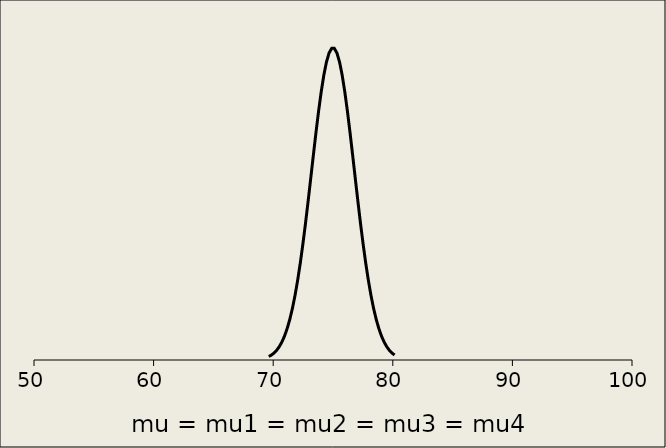
| Category | All conditions |
|---|---|
| 69.63343685400051 | 0.002 |
| 69.85248024771477 | 0.004 |
| 70.07152364142902 | 0.005 |
| 70.29056703514328 | 0.007 |
| 70.50961042885754 | 0.01 |
| 70.7286538225718 | 0.013 |
| 70.94769721628604 | 0.017 |
| 71.16674061000033 | 0.022 |
| 71.38578400371459 | 0.029 |
| 71.60482739742885 | 0.037 |
| 71.82387079114312 | 0.046 |
| 72.04291418485738 | 0.057 |
| 72.26195757857164 | 0.069 |
| 72.4810009722859 | 0.083 |
| 72.70004436600016 | 0.098 |
| 72.91908775971442 | 0.113 |
| 73.13813115342867 | 0.13 |
| 73.35717454714293 | 0.146 |
| 73.5762179408572 | 0.162 |
| 73.79526133457145 | 0.178 |
| 74.0143047282857 | 0.192 |
| 74.23334812199997 | 0.203 |
| 74.45239151571424 | 0.213 |
| 74.6714349094285 | 0.219 |
| 74.89047830314276 | 0.223 |
| 75.10952169685702 | 0.223 |
| 75.32856509057127 | 0.219 |
| 75.54760848428555 | 0.213 |
| 75.7666518779998 | 0.203 |
| 75.98569527171406 | 0.192 |
| 76.20473866542832 | 0.178 |
| 76.42378205914258 | 0.162 |
| 76.64282545285684 | 0.146 |
| 76.8618688465711 | 0.13 |
| 77.08091224028534 | 0.113 |
| 77.29995563399962 | 0.098 |
| 77.51899902771387 | 0.083 |
| 77.73804242142813 | 0.069 |
| 77.9570858151424 | 0.057 |
| 78.17612920885666 | 0.046 |
| 78.39517260257092 | 0.037 |
| 78.61421599628518 | 0.029 |
| 78.83325938999944 | 0.022 |
| 79.0523027837137 | 0.017 |
| 79.27134617742796 | 0.013 |
| 79.4903895711422 | 0.01 |
| 79.70943296485648 | 0.007 |
| 79.92847635857073 | 0.005 |
| 80.14751975228499 | 0.004 |